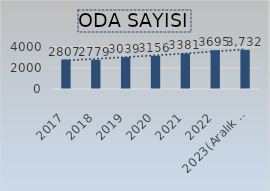
| Category | Series 6 |
|---|---|
| 2017 | 2807 |
| 2018 | 2779 |
| 2019 | 3039 |
| 2020 | 3156 |
| 2021 | 3381 |
| 2022 | 3695 |
| 2023(Aralık Ayı İtibariyle) | 3732 |